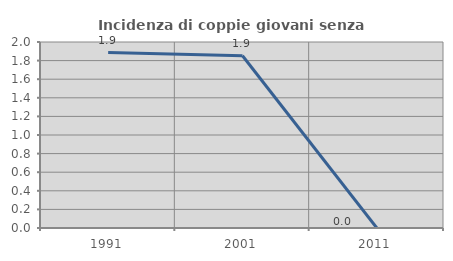
| Category | Incidenza di coppie giovani senza figli |
|---|---|
| 1991.0 | 1.887 |
| 2001.0 | 1.852 |
| 2011.0 | 0 |